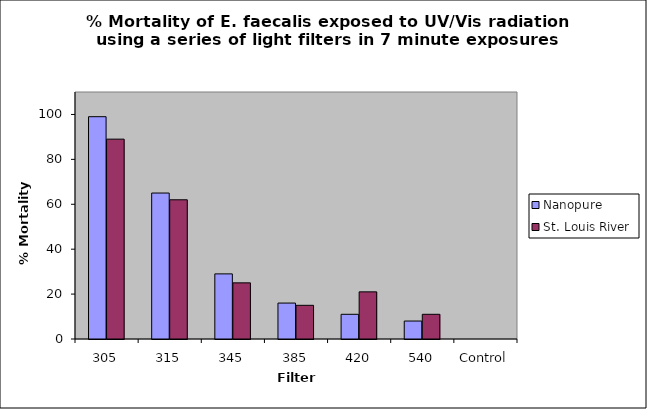
| Category | Nanopure | St. Louis River |
|---|---|---|
| 305 | 99 | 89 |
| 315 | 65 | 62 |
| 345 | 29 | 25 |
| 385 | 16 | 15 |
| 420 | 11 | 21 |
| 540 | 8 | 11 |
| Control | 0 | 0 |